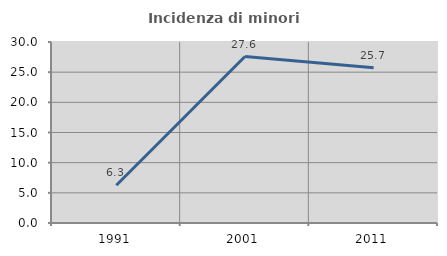
| Category | Incidenza di minori stranieri |
|---|---|
| 1991.0 | 6.25 |
| 2001.0 | 27.586 |
| 2011.0 | 25.738 |